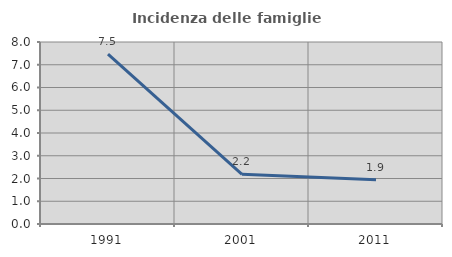
| Category | Incidenza delle famiglie numerose |
|---|---|
| 1991.0 | 7.463 |
| 2001.0 | 2.183 |
| 2011.0 | 1.942 |